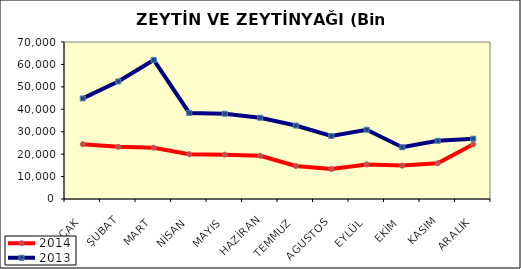
| Category | 2014 | 2013 |
|---|---|---|
| OCAK | 24433.782 | 44842.038 |
| ŞUBAT | 23262.338 | 52403.663 |
| MART | 22845.745 | 62002.927 |
| NİSAN | 19989.73 | 38388.413 |
| MAYIS | 19755.836 | 38035.659 |
| HAZİRAN | 19273.121 | 36239.687 |
| TEMMUZ | 14721.921 | 32745.501 |
| AGUSTOS | 13367.266 | 28125.712 |
| EYLÜL | 15411.823 | 30890.239 |
| EKİM | 14895.794 | 23072.369 |
| KASIM | 15949.551 | 25941.348 |
| ARALIK | 24375.959 | 26880.234 |